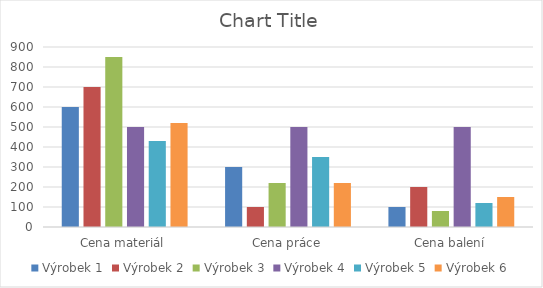
| Category | Výrobek 1 | Výrobek 2 | Výrobek 3 | Výrobek 4 | Výrobek 5 | Výrobek 6 |
|---|---|---|---|---|---|---|
| Cena materiál | 600 | 700 | 850 | 500 | 430 | 520 |
| Cena práce | 300 | 100 | 220 | 500 | 350 | 220 |
| Cena balení | 100 | 200 | 80 | 500 | 120 | 150 |